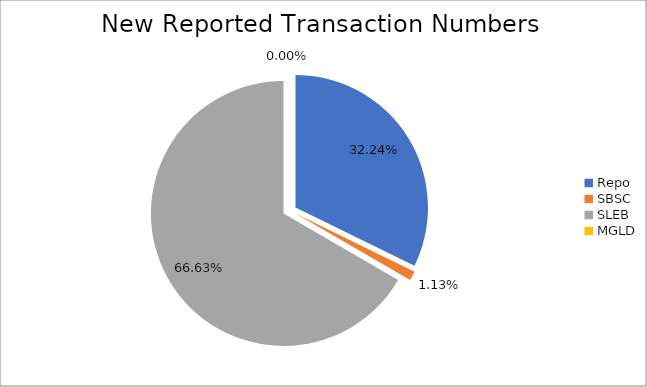
| Category | Series 0 |
|---|---|
| Repo | 312773 |
| SBSC | 10931 |
| SLEB | 646517 |
| MGLD | 24 |